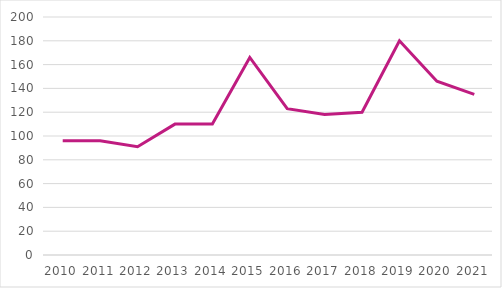
| Category | I alt |
|---|---|
| 2010.0 | 96 |
| 2011.0 | 96 |
| 2012.0 | 91 |
| 2013.0 | 110 |
| 2014.0 | 110 |
| 2015.0 | 166 |
| 2016.0 | 123 |
| 2017.0 | 118 |
| 2018.0 | 120 |
| 2019.0 | 180 |
| 2020.0 | 146 |
| 2021.0 | 135 |